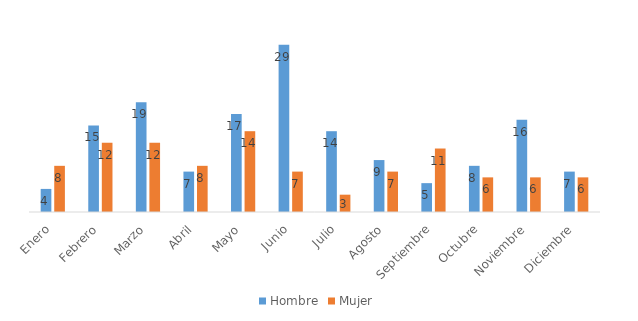
| Category | Hombre | Mujer |
|---|---|---|
| Enero | 4 | 8 |
| Febrero | 15 | 12 |
| Marzo | 19 | 12 |
| Abril | 7 | 8 |
| Mayo | 17 | 14 |
| Junio | 29 | 7 |
| Julio | 14 | 3 |
| Agosto | 9 | 7 |
| Septiembre | 5 | 11 |
| Octubre | 8 | 6 |
| Noviembre | 16 | 6 |
| Diciembre | 7 | 6 |